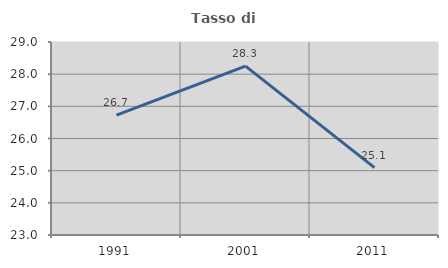
| Category | Tasso di occupazione   |
|---|---|
| 1991.0 | 26.726 |
| 2001.0 | 28.25 |
| 2011.0 | 25.094 |